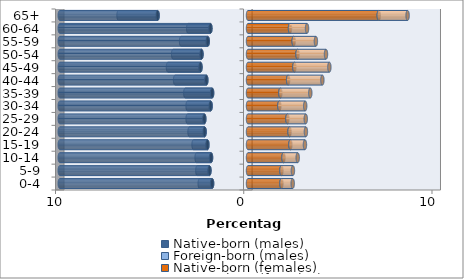
| Category | Native-born (males) | Foreign-born (males) | Native-born (females) | Foreign-born (females) |
|---|---|---|---|---|
| 0-4 | -1.907 | -0.658 | 1.777 | 0.598 |
| 5-9 | -2.047 | -0.645 | 1.777 | 0.609 |
| 10-14 | -1.963 | -0.766 | 1.885 | 0.756 |
| 15-19 | -2.156 | -0.737 | 2.253 | 0.772 |
| 20-24 | -2.305 | -0.802 | 2.207 | 0.869 |
| 25-29 | -2.321 | -0.888 | 2.093 | 0.975 |
| 30-34 | -1.985 | -1.224 | 1.665 | 1.373 |
| 35-39 | -1.907 | -1.424 | 1.72 | 1.59 |
| 40-44 | -2.213 | -1.66 | 2.131 | 1.82 |
| 45-49 | -2.524 | -1.728 | 2.464 | 1.858 |
| 50-54 | -2.47 | -1.506 | 2.63 | 1.514 |
| 55-59 | -2.139 | -1.414 | 2.426 | 1.181 |
| 60-64 | -1.996 | -1.181 | 2.231 | 0.905 |
| 65+ | -4.801 | -2.077 | 6.946 | 1.533 |